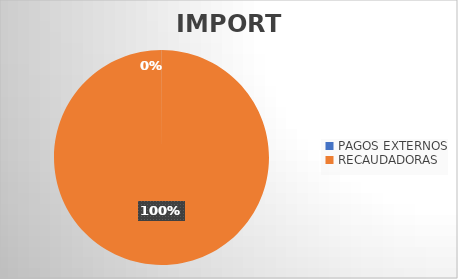
| Category | IMPORTE |
|---|---|
| PAGOS EXTERNOS | 257606.48 |
| RECAUDADORAS | 815633317.6 |